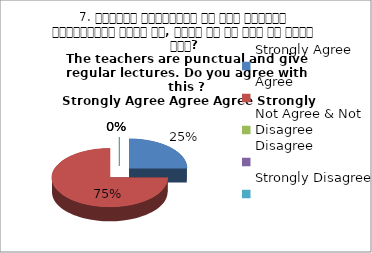
| Category | 7. शिक्षक समयनिष्ट है एवं नियमित व्याख्यान देते है, क्या आप इस बात से सहमत हैं? 
The teachers are punctual and give regular lectures. Do you agree with this ?
 Strongly Agree Agree Agree Strongly Agree Agree |
|---|---|
| Strongly Agree | 1 |
| Agree | 3 |
| Not Agree & Not Disagree | 0 |
| Disagree | 0 |
| Strongly Disagree | 0 |